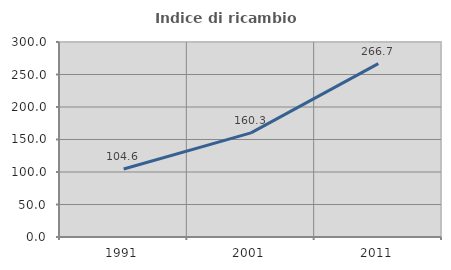
| Category | Indice di ricambio occupazionale  |
|---|---|
| 1991.0 | 104.587 |
| 2001.0 | 160.256 |
| 2011.0 | 266.667 |